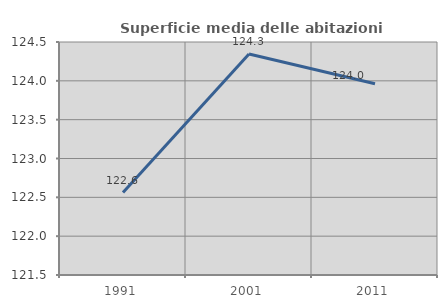
| Category | Superficie media delle abitazioni occupate |
|---|---|
| 1991.0 | 122.561 |
| 2001.0 | 124.346 |
| 2011.0 | 123.963 |